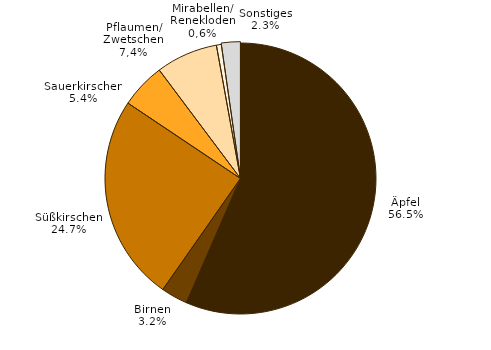
| Category | Series 0 |
|---|---|
| Äpfel | 873 |
| Birnen | 49 |
| Süßkirschen | 381 |
| Sauerkirschen | 83 |
| Pflaumen/Zwetschen | 114 |
| Mirabellen/Renekloden | 9 |
| Sonstiges | 35 |